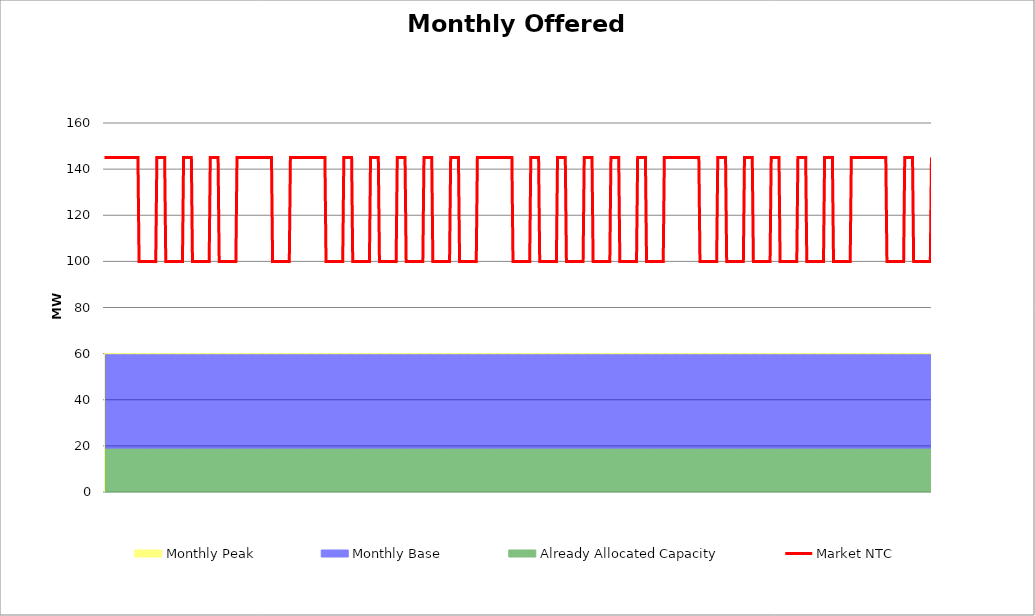
| Category | Market NTC |
|---|---|
| 0 | 145 |
| 1 | 145 |
| 2 | 145 |
| 3 | 145 |
| 4 | 145 |
| 5 | 145 |
| 6 | 145 |
| 7 | 145 |
| 8 | 145 |
| 9 | 145 |
| 10 | 145 |
| 11 | 145 |
| 12 | 145 |
| 13 | 145 |
| 14 | 145 |
| 15 | 145 |
| 16 | 145 |
| 17 | 145 |
| 18 | 145 |
| 19 | 145 |
| 20 | 145 |
| 21 | 145 |
| 22 | 145 |
| 23 | 145 |
| 24 | 145 |
| 25 | 145 |
| 26 | 145 |
| 27 | 145 |
| 28 | 145 |
| 29 | 145 |
| 30 | 145 |
| 31 | 100 |
| 32 | 100 |
| 33 | 100 |
| 34 | 100 |
| 35 | 100 |
| 36 | 100 |
| 37 | 100 |
| 38 | 100 |
| 39 | 100 |
| 40 | 100 |
| 41 | 100 |
| 42 | 100 |
| 43 | 100 |
| 44 | 100 |
| 45 | 100 |
| 46 | 100 |
| 47 | 145 |
| 48 | 145 |
| 49 | 145 |
| 50 | 145 |
| 51 | 145 |
| 52 | 145 |
| 53 | 145 |
| 54 | 145 |
| 55 | 100 |
| 56 | 100 |
| 57 | 100 |
| 58 | 100 |
| 59 | 100 |
| 60 | 100 |
| 61 | 100 |
| 62 | 100 |
| 63 | 100 |
| 64 | 100 |
| 65 | 100 |
| 66 | 100 |
| 67 | 100 |
| 68 | 100 |
| 69 | 100 |
| 70 | 100 |
| 71 | 145 |
| 72 | 145 |
| 73 | 145 |
| 74 | 145 |
| 75 | 145 |
| 76 | 145 |
| 77 | 145 |
| 78 | 145 |
| 79 | 100 |
| 80 | 100 |
| 81 | 100 |
| 82 | 100 |
| 83 | 100 |
| 84 | 100 |
| 85 | 100 |
| 86 | 100 |
| 87 | 100 |
| 88 | 100 |
| 89 | 100 |
| 90 | 100 |
| 91 | 100 |
| 92 | 100 |
| 93 | 100 |
| 94 | 100 |
| 95 | 145 |
| 96 | 145 |
| 97 | 145 |
| 98 | 145 |
| 99 | 145 |
| 100 | 145 |
| 101 | 145 |
| 102 | 145 |
| 103 | 100 |
| 104 | 100 |
| 105 | 100 |
| 106 | 100 |
| 107 | 100 |
| 108 | 100 |
| 109 | 100 |
| 110 | 100 |
| 111 | 100 |
| 112 | 100 |
| 113 | 100 |
| 114 | 100 |
| 115 | 100 |
| 116 | 100 |
| 117 | 100 |
| 118 | 100 |
| 119 | 145 |
| 120 | 145 |
| 121 | 145 |
| 122 | 145 |
| 123 | 145 |
| 124 | 145 |
| 125 | 145 |
| 126 | 145 |
| 127 | 145 |
| 128 | 145 |
| 129 | 145 |
| 130 | 145 |
| 131 | 145 |
| 132 | 145 |
| 133 | 145 |
| 134 | 145 |
| 135 | 145 |
| 136 | 145 |
| 137 | 145 |
| 138 | 145 |
| 139 | 145 |
| 140 | 145 |
| 141 | 145 |
| 142 | 145 |
| 143 | 145 |
| 144 | 145 |
| 145 | 145 |
| 146 | 145 |
| 147 | 145 |
| 148 | 145 |
| 149 | 145 |
| 150 | 145 |
| 151 | 100 |
| 152 | 100 |
| 153 | 100 |
| 154 | 100 |
| 155 | 100 |
| 156 | 100 |
| 157 | 100 |
| 158 | 100 |
| 159 | 100 |
| 160 | 100 |
| 161 | 100 |
| 162 | 100 |
| 163 | 100 |
| 164 | 100 |
| 165 | 100 |
| 166 | 100 |
| 167 | 145 |
| 168 | 145 |
| 169 | 145 |
| 170 | 145 |
| 171 | 145 |
| 172 | 145 |
| 173 | 145 |
| 174 | 145 |
| 175 | 145 |
| 176 | 145 |
| 177 | 145 |
| 178 | 145 |
| 179 | 145 |
| 180 | 145 |
| 181 | 145 |
| 182 | 145 |
| 183 | 145 |
| 184 | 145 |
| 185 | 145 |
| 186 | 145 |
| 187 | 145 |
| 188 | 145 |
| 189 | 145 |
| 190 | 145 |
| 191 | 145 |
| 192 | 145 |
| 193 | 145 |
| 194 | 145 |
| 195 | 145 |
| 196 | 145 |
| 197 | 145 |
| 198 | 145 |
| 199 | 100 |
| 200 | 100 |
| 201 | 100 |
| 202 | 100 |
| 203 | 100 |
| 204 | 100 |
| 205 | 100 |
| 206 | 100 |
| 207 | 100 |
| 208 | 100 |
| 209 | 100 |
| 210 | 100 |
| 211 | 100 |
| 212 | 100 |
| 213 | 100 |
| 214 | 100 |
| 215 | 145 |
| 216 | 145 |
| 217 | 145 |
| 218 | 145 |
| 219 | 145 |
| 220 | 145 |
| 221 | 145 |
| 222 | 145 |
| 223 | 100 |
| 224 | 100 |
| 225 | 100 |
| 226 | 100 |
| 227 | 100 |
| 228 | 100 |
| 229 | 100 |
| 230 | 100 |
| 231 | 100 |
| 232 | 100 |
| 233 | 100 |
| 234 | 100 |
| 235 | 100 |
| 236 | 100 |
| 237 | 100 |
| 238 | 100 |
| 239 | 145 |
| 240 | 145 |
| 241 | 145 |
| 242 | 145 |
| 243 | 145 |
| 244 | 145 |
| 245 | 145 |
| 246 | 145 |
| 247 | 100 |
| 248 | 100 |
| 249 | 100 |
| 250 | 100 |
| 251 | 100 |
| 252 | 100 |
| 253 | 100 |
| 254 | 100 |
| 255 | 100 |
| 256 | 100 |
| 257 | 100 |
| 258 | 100 |
| 259 | 100 |
| 260 | 100 |
| 261 | 100 |
| 262 | 100 |
| 263 | 145 |
| 264 | 145 |
| 265 | 145 |
| 266 | 145 |
| 267 | 145 |
| 268 | 145 |
| 269 | 145 |
| 270 | 145 |
| 271 | 100 |
| 272 | 100 |
| 273 | 100 |
| 274 | 100 |
| 275 | 100 |
| 276 | 100 |
| 277 | 100 |
| 278 | 100 |
| 279 | 100 |
| 280 | 100 |
| 281 | 100 |
| 282 | 100 |
| 283 | 100 |
| 284 | 100 |
| 285 | 100 |
| 286 | 100 |
| 287 | 145 |
| 288 | 145 |
| 289 | 145 |
| 290 | 145 |
| 291 | 145 |
| 292 | 145 |
| 293 | 145 |
| 294 | 145 |
| 295 | 100 |
| 296 | 100 |
| 297 | 100 |
| 298 | 100 |
| 299 | 100 |
| 300 | 100 |
| 301 | 100 |
| 302 | 100 |
| 303 | 100 |
| 304 | 100 |
| 305 | 100 |
| 306 | 100 |
| 307 | 100 |
| 308 | 100 |
| 309 | 100 |
| 310 | 100 |
| 311 | 145 |
| 312 | 145 |
| 313 | 145 |
| 314 | 145 |
| 315 | 145 |
| 316 | 145 |
| 317 | 145 |
| 318 | 145 |
| 319 | 100 |
| 320 | 100 |
| 321 | 100 |
| 322 | 100 |
| 323 | 100 |
| 324 | 100 |
| 325 | 100 |
| 326 | 100 |
| 327 | 100 |
| 328 | 100 |
| 329 | 100 |
| 330 | 100 |
| 331 | 100 |
| 332 | 100 |
| 333 | 100 |
| 334 | 100 |
| 335 | 145 |
| 336 | 145 |
| 337 | 145 |
| 338 | 145 |
| 339 | 145 |
| 340 | 145 |
| 341 | 145 |
| 342 | 145 |
| 343 | 145 |
| 344 | 145 |
| 345 | 145 |
| 346 | 145 |
| 347 | 145 |
| 348 | 145 |
| 349 | 145 |
| 350 | 145 |
| 351 | 145 |
| 352 | 145 |
| 353 | 145 |
| 354 | 145 |
| 355 | 145 |
| 356 | 145 |
| 357 | 145 |
| 358 | 145 |
| 359 | 145 |
| 360 | 145 |
| 361 | 145 |
| 362 | 145 |
| 363 | 145 |
| 364 | 145 |
| 365 | 145 |
| 366 | 145 |
| 367 | 100 |
| 368 | 100 |
| 369 | 100 |
| 370 | 100 |
| 371 | 100 |
| 372 | 100 |
| 373 | 100 |
| 374 | 100 |
| 375 | 100 |
| 376 | 100 |
| 377 | 100 |
| 378 | 100 |
| 379 | 100 |
| 380 | 100 |
| 381 | 100 |
| 382 | 100 |
| 383 | 145 |
| 384 | 145 |
| 385 | 145 |
| 386 | 145 |
| 387 | 145 |
| 388 | 145 |
| 389 | 145 |
| 390 | 145 |
| 391 | 100 |
| 392 | 100 |
| 393 | 100 |
| 394 | 100 |
| 395 | 100 |
| 396 | 100 |
| 397 | 100 |
| 398 | 100 |
| 399 | 100 |
| 400 | 100 |
| 401 | 100 |
| 402 | 100 |
| 403 | 100 |
| 404 | 100 |
| 405 | 100 |
| 406 | 100 |
| 407 | 145 |
| 408 | 145 |
| 409 | 145 |
| 410 | 145 |
| 411 | 145 |
| 412 | 145 |
| 413 | 145 |
| 414 | 145 |
| 415 | 100 |
| 416 | 100 |
| 417 | 100 |
| 418 | 100 |
| 419 | 100 |
| 420 | 100 |
| 421 | 100 |
| 422 | 100 |
| 423 | 100 |
| 424 | 100 |
| 425 | 100 |
| 426 | 100 |
| 427 | 100 |
| 428 | 100 |
| 429 | 100 |
| 430 | 100 |
| 431 | 145 |
| 432 | 145 |
| 433 | 145 |
| 434 | 145 |
| 435 | 145 |
| 436 | 145 |
| 437 | 145 |
| 438 | 145 |
| 439 | 100 |
| 440 | 100 |
| 441 | 100 |
| 442 | 100 |
| 443 | 100 |
| 444 | 100 |
| 445 | 100 |
| 446 | 100 |
| 447 | 100 |
| 448 | 100 |
| 449 | 100 |
| 450 | 100 |
| 451 | 100 |
| 452 | 100 |
| 453 | 100 |
| 454 | 100 |
| 455 | 145 |
| 456 | 145 |
| 457 | 145 |
| 458 | 145 |
| 459 | 145 |
| 460 | 145 |
| 461 | 145 |
| 462 | 145 |
| 463 | 100 |
| 464 | 100 |
| 465 | 100 |
| 466 | 100 |
| 467 | 100 |
| 468 | 100 |
| 469 | 100 |
| 470 | 100 |
| 471 | 100 |
| 472 | 100 |
| 473 | 100 |
| 474 | 100 |
| 475 | 100 |
| 476 | 100 |
| 477 | 100 |
| 478 | 100 |
| 479 | 145 |
| 480 | 145 |
| 481 | 145 |
| 482 | 145 |
| 483 | 145 |
| 484 | 145 |
| 485 | 145 |
| 486 | 145 |
| 487 | 100 |
| 488 | 100 |
| 489 | 100 |
| 490 | 100 |
| 491 | 100 |
| 492 | 100 |
| 493 | 100 |
| 494 | 100 |
| 495 | 100 |
| 496 | 100 |
| 497 | 100 |
| 498 | 100 |
| 499 | 100 |
| 500 | 100 |
| 501 | 100 |
| 502 | 100 |
| 503 | 145 |
| 504 | 145 |
| 505 | 145 |
| 506 | 145 |
| 507 | 145 |
| 508 | 145 |
| 509 | 145 |
| 510 | 145 |
| 511 | 145 |
| 512 | 145 |
| 513 | 145 |
| 514 | 145 |
| 515 | 145 |
| 516 | 145 |
| 517 | 145 |
| 518 | 145 |
| 519 | 145 |
| 520 | 145 |
| 521 | 145 |
| 522 | 145 |
| 523 | 145 |
| 524 | 145 |
| 525 | 145 |
| 526 | 145 |
| 527 | 145 |
| 528 | 145 |
| 529 | 145 |
| 530 | 145 |
| 531 | 145 |
| 532 | 145 |
| 533 | 145 |
| 534 | 145 |
| 535 | 100 |
| 536 | 100 |
| 537 | 100 |
| 538 | 100 |
| 539 | 100 |
| 540 | 100 |
| 541 | 100 |
| 542 | 100 |
| 543 | 100 |
| 544 | 100 |
| 545 | 100 |
| 546 | 100 |
| 547 | 100 |
| 548 | 100 |
| 549 | 100 |
| 550 | 100 |
| 551 | 145 |
| 552 | 145 |
| 553 | 145 |
| 554 | 145 |
| 555 | 145 |
| 556 | 145 |
| 557 | 145 |
| 558 | 145 |
| 559 | 100 |
| 560 | 100 |
| 561 | 100 |
| 562 | 100 |
| 563 | 100 |
| 564 | 100 |
| 565 | 100 |
| 566 | 100 |
| 567 | 100 |
| 568 | 100 |
| 569 | 100 |
| 570 | 100 |
| 571 | 100 |
| 572 | 100 |
| 573 | 100 |
| 574 | 100 |
| 575 | 145 |
| 576 | 145 |
| 577 | 145 |
| 578 | 145 |
| 579 | 145 |
| 580 | 145 |
| 581 | 145 |
| 582 | 145 |
| 583 | 100 |
| 584 | 100 |
| 585 | 100 |
| 586 | 100 |
| 587 | 100 |
| 588 | 100 |
| 589 | 100 |
| 590 | 100 |
| 591 | 100 |
| 592 | 100 |
| 593 | 100 |
| 594 | 100 |
| 595 | 100 |
| 596 | 100 |
| 597 | 100 |
| 598 | 100 |
| 599 | 145 |
| 600 | 145 |
| 601 | 145 |
| 602 | 145 |
| 603 | 145 |
| 604 | 145 |
| 605 | 145 |
| 606 | 145 |
| 607 | 100 |
| 608 | 100 |
| 609 | 100 |
| 610 | 100 |
| 611 | 100 |
| 612 | 100 |
| 613 | 100 |
| 614 | 100 |
| 615 | 100 |
| 616 | 100 |
| 617 | 100 |
| 618 | 100 |
| 619 | 100 |
| 620 | 100 |
| 621 | 100 |
| 622 | 100 |
| 623 | 145 |
| 624 | 145 |
| 625 | 145 |
| 626 | 145 |
| 627 | 145 |
| 628 | 145 |
| 629 | 145 |
| 630 | 145 |
| 631 | 100 |
| 632 | 100 |
| 633 | 100 |
| 634 | 100 |
| 635 | 100 |
| 636 | 100 |
| 637 | 100 |
| 638 | 100 |
| 639 | 100 |
| 640 | 100 |
| 641 | 100 |
| 642 | 100 |
| 643 | 100 |
| 644 | 100 |
| 645 | 100 |
| 646 | 100 |
| 647 | 145 |
| 648 | 145 |
| 649 | 145 |
| 650 | 145 |
| 651 | 145 |
| 652 | 145 |
| 653 | 145 |
| 654 | 145 |
| 655 | 100 |
| 656 | 100 |
| 657 | 100 |
| 658 | 100 |
| 659 | 100 |
| 660 | 100 |
| 661 | 100 |
| 662 | 100 |
| 663 | 100 |
| 664 | 100 |
| 665 | 100 |
| 666 | 100 |
| 667 | 100 |
| 668 | 100 |
| 669 | 100 |
| 670 | 100 |
| 671 | 145 |
| 672 | 145 |
| 673 | 145 |
| 674 | 145 |
| 675 | 145 |
| 676 | 145 |
| 677 | 145 |
| 678 | 145 |
| 679 | 145 |
| 680 | 145 |
| 681 | 145 |
| 682 | 145 |
| 683 | 145 |
| 684 | 145 |
| 685 | 145 |
| 686 | 145 |
| 687 | 145 |
| 688 | 145 |
| 689 | 145 |
| 690 | 145 |
| 691 | 145 |
| 692 | 145 |
| 693 | 145 |
| 694 | 145 |
| 695 | 145 |
| 696 | 145 |
| 697 | 145 |
| 698 | 145 |
| 699 | 145 |
| 700 | 145 |
| 701 | 145 |
| 702 | 145 |
| 703 | 100 |
| 704 | 100 |
| 705 | 100 |
| 706 | 100 |
| 707 | 100 |
| 708 | 100 |
| 709 | 100 |
| 710 | 100 |
| 711 | 100 |
| 712 | 100 |
| 713 | 100 |
| 714 | 100 |
| 715 | 100 |
| 716 | 100 |
| 717 | 100 |
| 718 | 100 |
| 719 | 145 |
| 720 | 145 |
| 721 | 145 |
| 722 | 145 |
| 723 | 145 |
| 724 | 145 |
| 725 | 145 |
| 726 | 145 |
| 727 | 100 |
| 728 | 100 |
| 729 | 100 |
| 730 | 100 |
| 731 | 100 |
| 732 | 100 |
| 733 | 100 |
| 734 | 100 |
| 735 | 100 |
| 736 | 100 |
| 737 | 100 |
| 738 | 100 |
| 739 | 100 |
| 740 | 100 |
| 741 | 100 |
| 742 | 100 |
| 743 | 145 |